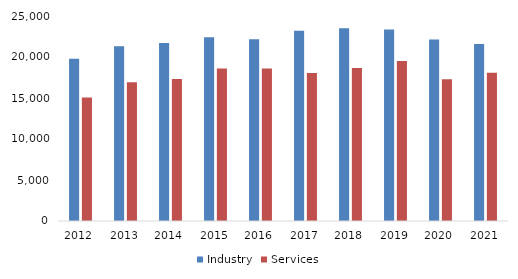
| Category | Industry | Services |
|---|---|---|
| 2012.0 | 19775 | 15060 |
| 2013.0 | 21302 | 16920 |
| 2014.0 | 21697 | 17302 |
| 2015.0 | 22423 | 18586 |
| 2016.0 | 22173 | 18597 |
| 2017.0 | 23198 | 18049 |
| 2018.0 | 23518 | 18673 |
| 2019.0 | 23358 | 19518 |
| 2020.0 | 22124 | 17277 |
| 2021.0 | 21600 | 18093 |